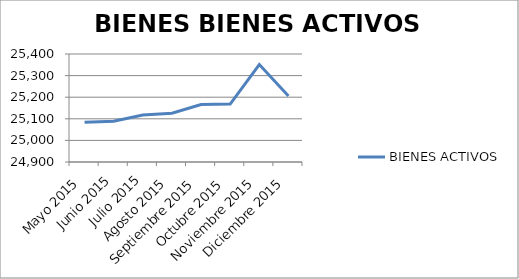
| Category | BIENES ACTIVOS |
|---|---|
| Mayo 2015 | 25084 |
| Junio 2015 | 25089 |
| Julio 2015 | 25118 |
| Agosto 2015 | 25126 |
| Septiembre 2015 | 25166 |
| Octubre 2015 | 25168 |
| Noviembre 2015 | 25351 |
| Diciembre 2015 | 25206 |